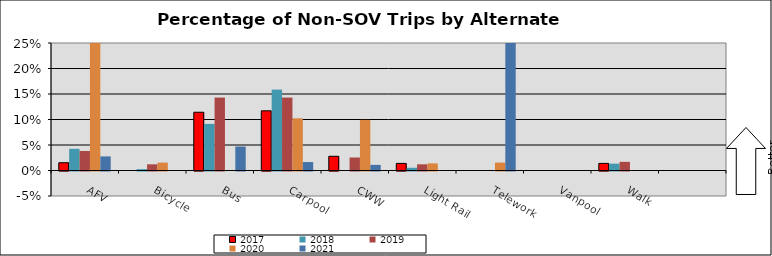
| Category | 2017 | 2018 | 2019 | 2020 | 2021 |
|---|---|---|---|---|---|
| AFV | 0.015 | 0.042 | 0.038 | 0.753 | 0.028 |
| Bicycle | 0 | 0.003 | 0.012 | 0.016 | 0 |
| Bus | 0.114 | 0.091 | 0.143 | 0 | 0.047 |
| Carpool | 0.117 | 0.159 | 0.143 | 0.102 | 0.017 |
| CWW | 0.028 | 0 | 0.025 | 0.099 | 0.011 |
| Light Rail | 0.014 | 0.005 | 0.012 | 0.014 | 0 |
| Telework | 0 | 0 | 0 | 0.016 | 0.304 |
| Vanpool | 0 | 0 | 0 | 0 | 0 |
| Walk | 0.014 | 0.013 | 0.017 | 0 | 0 |